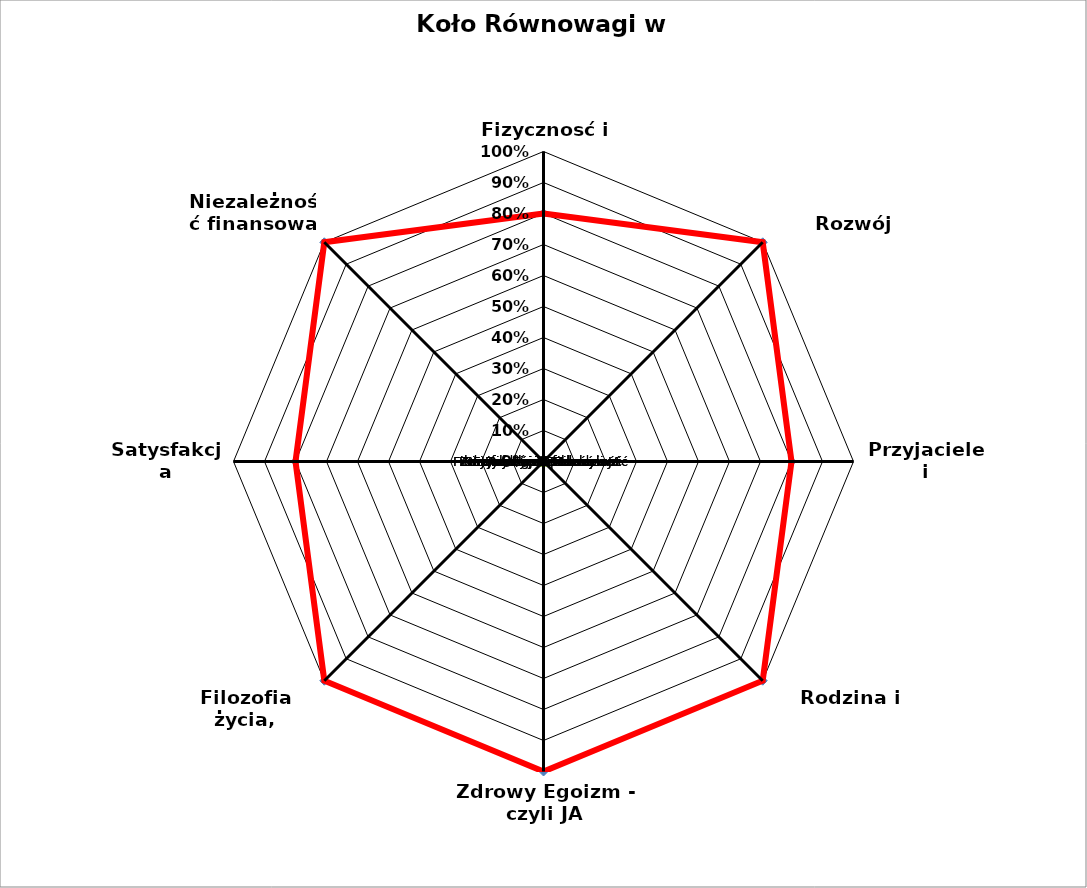
| Category | Series 0 | Series 1 | Series 2 | Series 3 | Series 4 |
|---|---|---|---|---|---|
| Fizycznosć i Zdrowie | 0.8 | 0 |  |  |  |
| Rozwój Osobowy | 1 | 0 |  |  |  |
| Przyjaciele i Społeczność | 0.8 | 0 |  |  |  |
| Rodzina i Miłość | 1 | 0 |  |  |  |
| Zdrowy Egoizm - czyli JA | 1 | 0 |  |  |  |
| Filozofia życia, Duchowość | 1 | 0 |  |  |  |
| Satysfakcja Zawodowa | 0.8 | 0 |  |  |  |
| Niezależność finansowa | 1 | 0 |  |  |  |